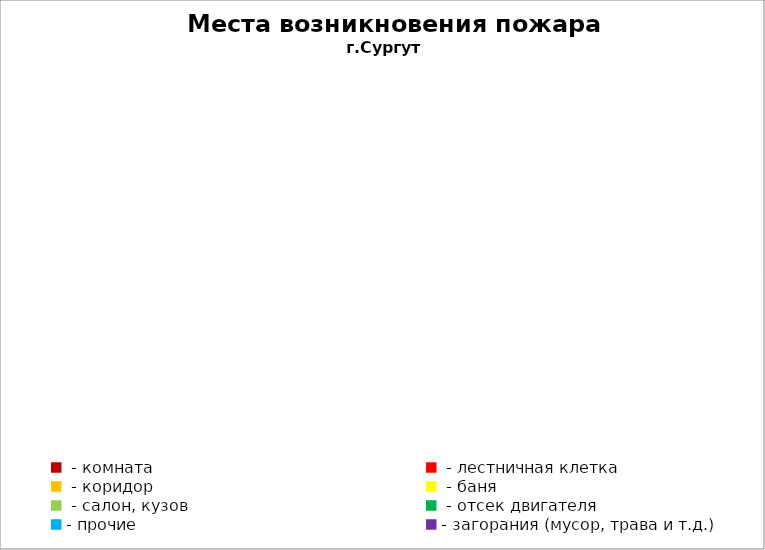
| Category | Места возникновения пожара |
|---|---|
|  - комната | 41 |
|  - лестничная клетка | 10 |
|  - коридор | 5 |
|  - баня | 12 |
|  - салон, кузов | 4 |
|  - отсек двигателя | 10 |
| - прочие | 48 |
| - загорания (мусор, трава и т.д.)  | 78 |